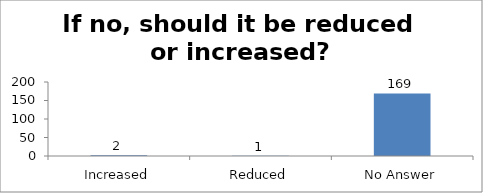
| Category | If no, should it be reduced or increased? |
|---|---|
| Increased | 2 |
| Reduced | 1 |
| No Answer | 169 |